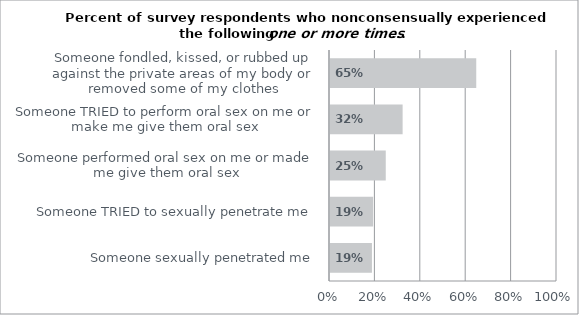
| Category | Yes, one or more times count |
|---|---|
| Someone sexually penetrated me | 0.189 |
| Someone TRIED to sexually penetrate me | 0.194 |
| Someone performed oral sex on me or made me give them oral sex | 0.25 |
| Someone TRIED to perform oral sex on me or make me give them oral sex | 0.324 |
| Someone fondled, kissed, or rubbed up against the private areas of my body or removed some of my clothes | 0.649 |